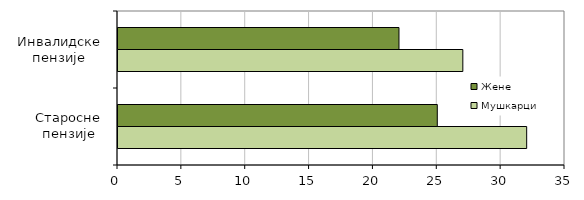
| Category | Мушкарци | Жене |
|---|---|---|
| Старосне
пензије | 32 | 25 |
| Инвалидске
пензије | 27 | 22 |